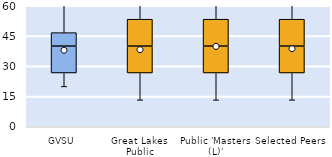
| Category | 25th | 50th | 75th |
|---|---|---|---|
| GVSU | 26.667 | 13.333 | 6.667 |
| Great Lakes Public | 26.667 | 13.333 | 13.333 |
| Public 'Masters (L)' | 26.667 | 13.333 | 13.333 |
| Selected Peers | 26.667 | 13.333 | 13.333 |